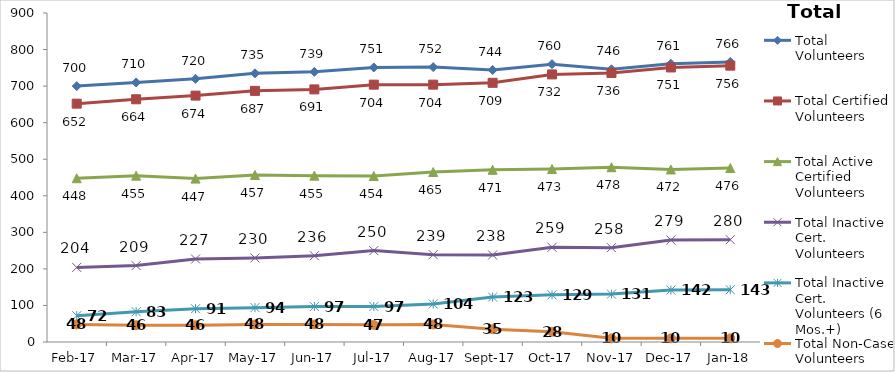
| Category | Total Volunteers | Total Certified Volunteers | Total Active Certified Volunteers | Total Inactive Cert. Volunteers | Total Inactive Cert. Volunteers (6 Mos.+) | Total Non-Case Volunteers |
|---|---|---|---|---|---|---|
| 2017-02-01 | 700 | 652 | 448 | 204 | 72 | 48 |
| 2017-03-01 | 710 | 664 | 455 | 209 | 83 | 46 |
| 2017-04-01 | 720 | 674 | 447 | 227 | 91 | 46 |
| 2017-05-01 | 735 | 687 | 457 | 230 | 94 | 48 |
| 2017-06-01 | 739 | 691 | 455 | 236 | 97 | 48 |
| 2017-07-01 | 751 | 704 | 454 | 250 | 97 | 47 |
| 2017-08-01 | 752 | 704 | 465 | 239 | 104 | 48 |
| 2017-09-01 | 744 | 709 | 471 | 238 | 123 | 35 |
| 2017-10-01 | 760 | 732 | 473 | 259 | 129 | 28 |
| 2017-11-01 | 746 | 736 | 478 | 258 | 131 | 10 |
| 2017-12-01 | 761 | 751 | 472 | 279 | 142 | 10 |
| 2018-01-01 | 766 | 756 | 476 | 280 | 143 | 10 |